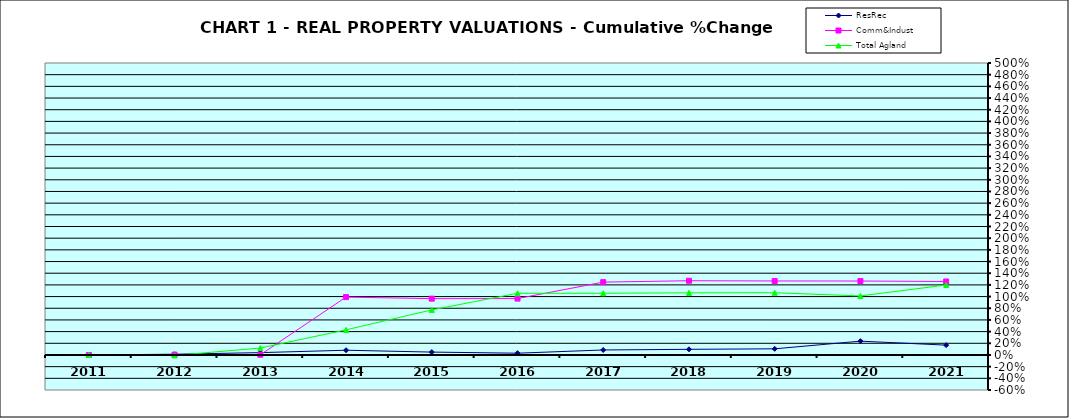
| Category | ResRec | Comm&Indust | Total Agland |
|---|---|---|---|
| 2011.0 | 0 | 0 | 0 |
| 2012.0 | 0.013 | 0.005 | -0.007 |
| 2013.0 | 0.04 | 0.004 | 0.118 |
| 2014.0 | 0.081 | 0.991 | 0.43 |
| 2015.0 | 0.049 | 0.964 | 0.772 |
| 2016.0 | 0.03 | 0.966 | 1.056 |
| 2017.0 | 0.085 | 1.248 | 1.057 |
| 2018.0 | 0.097 | 1.271 | 1.063 |
| 2019.0 | 0.105 | 1.267 | 1.066 |
| 2020.0 | 0.237 | 1.266 | 1.011 |
| 2021.0 | 0.168 | 1.258 | 1.198 |